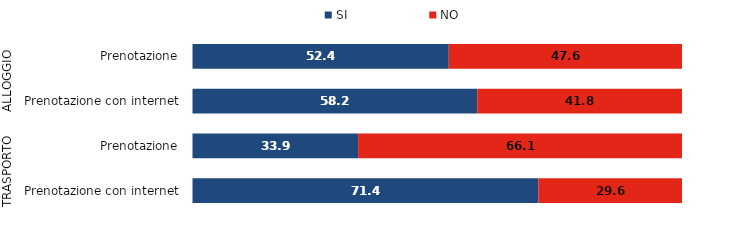
| Category | SI | NO |
|---|---|---|
| 0 | 52.4 | 47.6 |
| 1 | 58.2 | 41.8 |
| 2 | 33.9 | 66.1 |
| 3 | 71.4 | 29.6 |